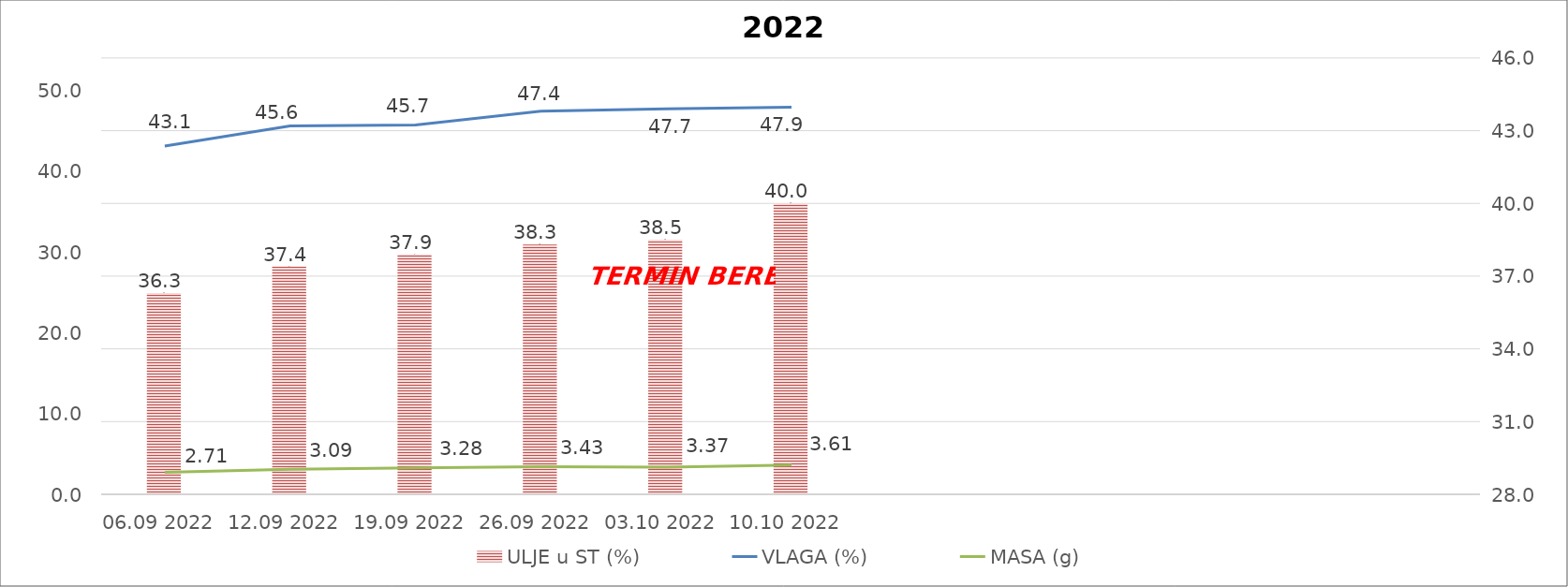
| Category | ULJE u ST (%) |
|---|---|
| 06.09 2022 | 36.3 |
| 12.09 2022 | 37.4 |
| 19.09 2022 | 37.9 |
| 26.09 2022 | 38.3 |
| 03.10 2022 | 38.5 |
| 10.10 2022 | 40 |